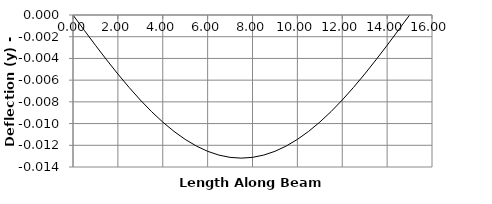
| Category | y |
|---|---|
| 0.0 | 0 |
| 0.5 | -0.001 |
| 1.0 | -0.003 |
| 1.5 | -0.004 |
| 2.0 | -0.005 |
| 2.00001 | -0.005 |
| 2.5 | -0.007 |
| 3.0 | -0.008 |
| 3.5 | -0.009 |
| 4.0 | -0.01 |
| 4.5 | -0.011 |
| 5.0 | -0.011 |
| 5.5 | -0.012 |
| 6.0 | -0.013 |
| 6.5 | -0.013 |
| 7.0 | -0.013 |
| 7.5 | -0.013 |
| 8.0 | -0.013 |
| 8.5 | -0.013 |
| 9.0 | -0.013 |
| 9.5 | -0.012 |
| 10.0 | -0.011 |
| 10.5 | -0.011 |
| 11.0 | -0.01 |
| 11.5 | -0.009 |
| 12.0 | -0.008 |
| 12.5 | -0.007 |
| 13.0 | -0.005 |
| 13.5 | -0.004 |
| 14.0 | -0.003 |
| 14.5 | -0.001 |
| 15.0 | 0 |